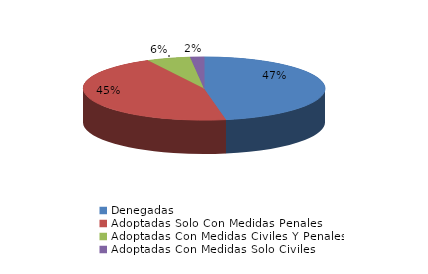
| Category | Series 0 |
|---|---|
| Denegadas | 179 |
| Adoptadas Solo Con Medidas Penales | 172 |
| Adoptadas Con Medidas Civiles Y Penales | 22 |
| Adoptadas Con Medidas Solo Civiles | 7 |